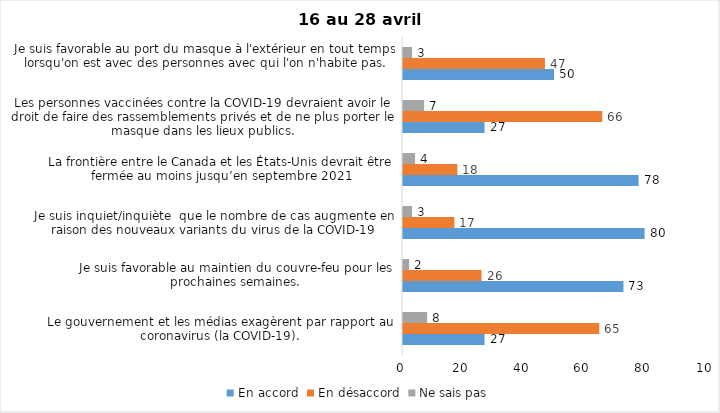
| Category | En accord | En désaccord | Ne sais pas |
|---|---|---|---|
| Le gouvernement et les médias exagèrent par rapport au coronavirus (la COVID-19). | 27 | 65 | 8 |
| Je suis favorable au maintien du couvre-feu pour les prochaines semaines. | 73 | 26 | 2 |
| Je suis inquiet/inquiète  que le nombre de cas augmente en raison des nouveaux variants du virus de la COVID-19 | 80 | 17 | 3 |
| La frontière entre le Canada et les États-Unis devrait être fermée au moins jusqu’en septembre 2021 | 78 | 18 | 4 |
| Les personnes vaccinées contre la COVID-19 devraient avoir le droit de faire des rassemblements privés et de ne plus porter le masque dans les lieux publics. | 27 | 66 | 7 |
| Je suis favorable au port du masque à l'extérieur en tout temps lorsqu'on est avec des personnes avec qui l'on n'habite pas. | 50 | 47 | 3 |